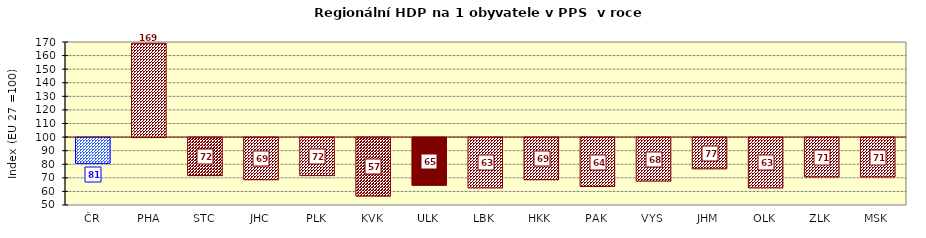
| Category | Series 1 |
|---|---|
| ČR | 81 |
| PHA | 169 |
| STC | 72 |
| JHC | 69 |
| PLK | 72 |
| KVK | 57 |
| ULK | 65 |
| LBK | 63 |
| HKK | 69 |
| PAK | 64 |
| VYS | 68 |
| JHM | 77 |
| OLK | 63 |
| ZLK | 71 |
| MSK | 71 |